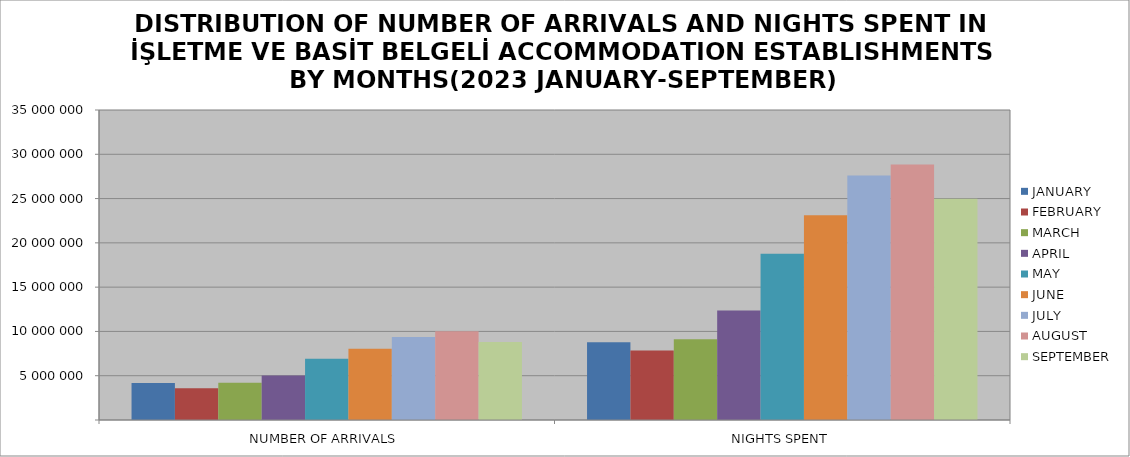
| Category | JANUARY | FEBRUARY | MARCH | APRIL | MAY | JUNE | JULY | AUGUST | SEPTEMBER |
|---|---|---|---|---|---|---|---|---|---|
| NUMBER OF ARRIVALS | 4176369 | 3577989 | 4200030 | 5022587 | 6927000 | 8050681 | 9379348 | 10028953 | 8800056 |
| NIGHTS SPENT | 8783046 | 7837722 | 9122802 | 12360237 | 18778808 | 23106038 | 27617279 | 28851182 | 24974127 |